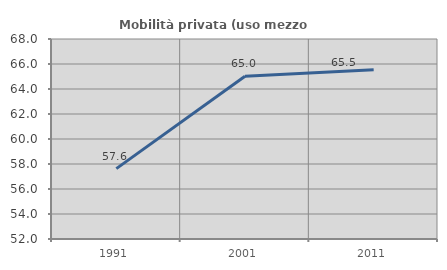
| Category | Mobilità privata (uso mezzo privato) |
|---|---|
| 1991.0 | 57.632 |
| 2001.0 | 65.025 |
| 2011.0 | 65.544 |